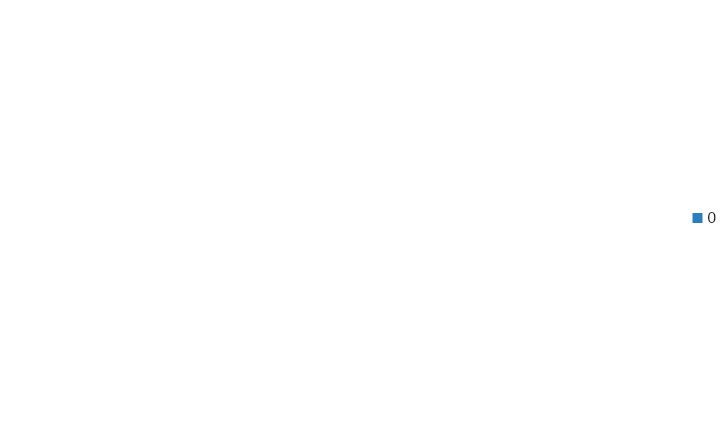
| Category | #DIV/0! |
|---|---|
| 0.0 | 0 |